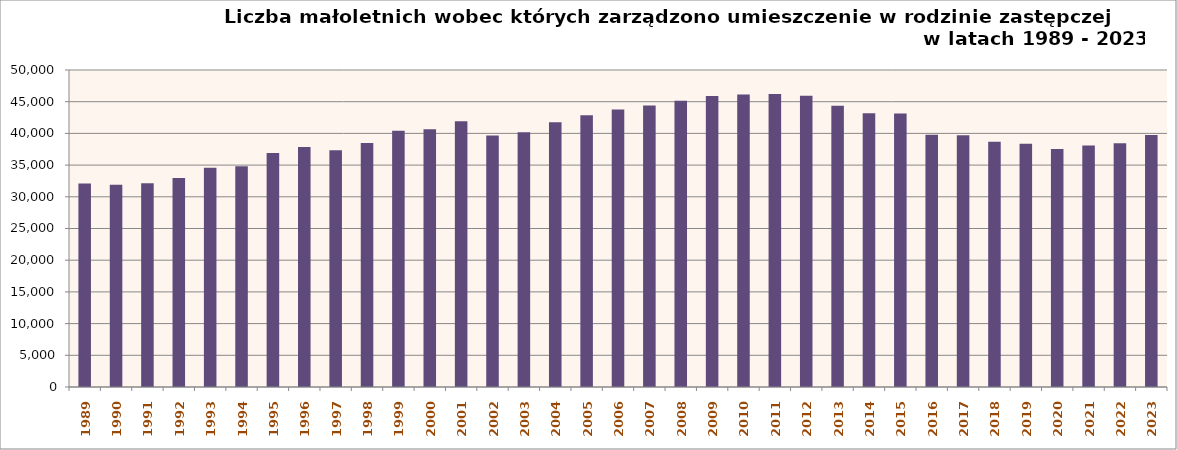
| Category | Liczba małoletnich wobec których zarządzono umieszczenie w rodzinie zastępczej w latach 1989 - 2015 |
|---|---|
| 1989.0 | 32087 |
| 1990.0 | 31881 |
| 1991.0 | 32130 |
| 1992.0 | 32968 |
| 1993.0 | 34565 |
| 1994.0 | 34801 |
| 1995.0 | 36894 |
| 1996.0 | 37839 |
| 1997.0 | 37341 |
| 1998.0 | 38496 |
| 1999.0 | 40434 |
| 2000.0 | 40650 |
| 2001.0 | 41925 |
| 2002.0 | 39683 |
| 2003.0 | 40197 |
| 2004.0 | 41754 |
| 2005.0 | 42855 |
| 2006.0 | 43785 |
| 2007.0 | 44412 |
| 2008.0 | 45150 |
| 2009.0 | 45907 |
| 2010.0 | 46145 |
| 2011.0 | 46197 |
| 2012.0 | 45946 |
| 2013.0 | 44379 |
| 2014.0 | 43164 |
| 2015.0 | 43154 |
| 2016.0 | 39796 |
| 2017.0 | 39695 |
| 2018.0 | 38690 |
| 2019.0 | 38359 |
| 2020.0 | 37521 |
| 2021.0 | 38100 |
| 2022.0 | 38461 |
| 2023.0 | 39728 |